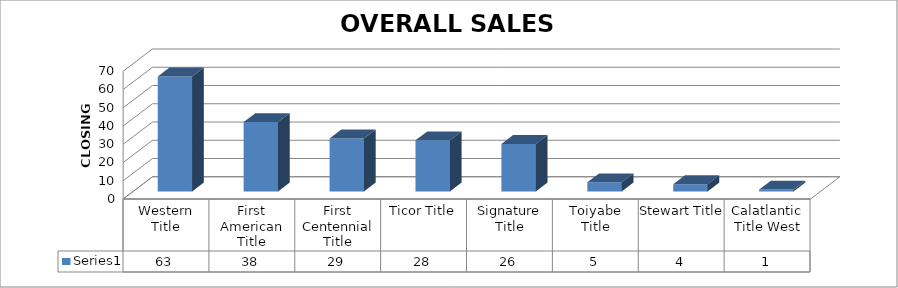
| Category | Series 0 |
|---|---|
| Western Title | 63 |
| First American Title | 38 |
| First Centennial Title | 29 |
| Ticor Title | 28 |
| Signature Title | 26 |
| Toiyabe Title | 5 |
| Stewart Title | 4 |
| Calatlantic Title West | 1 |